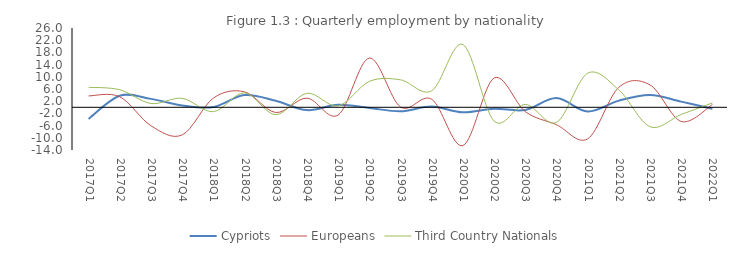
| Category | Cypriots | Europeans | Third Country Nationals |
|---|---|---|---|
| 2017Q1 | -3.809 | 3.731 | 6.555 |
| 2017Q2 | 3.791 | 3.452 | 5.745 |
| 2017Q3 | 2.76 | -6.051 | 1.245 |
| 2017Q4 | 0.611 | -9.065 | 2.94 |
| 2018Q1 | 0.102 | 3.027 | -1.426 |
| 2018Q2 | 4.023 | 5.079 | 4.742 |
| 2018Q3 | 2.13 | -1.698 | -2.439 |
| 2018Q4 | -0.92 | 3.002 | 4.61 |
| 2019Q1 | 0.847 | -2.551 | 0.424 |
| 2019Q2 | -0.212 | 16.147 | 8.492 |
| 2019Q3 | -1.307 | 0.095 | 9.007 |
| 2019Q4 | 0.246 | 2.642 | 5.414 |
| 2020Q1 | -1.648 | -12.551 | 20.599 |
| 2020Q2 | -0.459 | 9.585 | -4.501 |
| 2020Q3 | -0.868 | -1.397 | 0.948 |
| 2020Q4 | 3.026 | -5.709 | -4.94 |
| 2021Q1 | -1.383 | -10.349 | 11.181 |
| 2021Q2 | 2.188 | 6.564 | 5.695 |
| 2021Q3 | 4.07 | 7.34 | -6.362 |
| 2021Q4 | 1.853 | -4.645 | -2.354 |
| 2022Q1 | -0.481 | 0.899 | 1.427 |